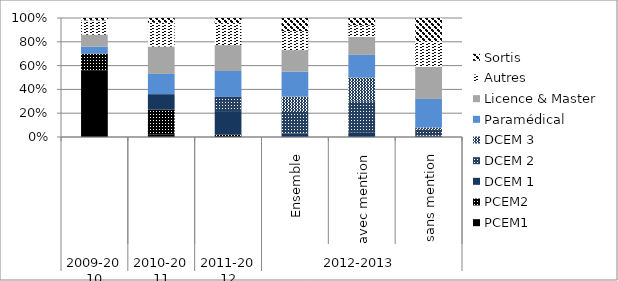
| Category | PCEM1 | PCEM2 | DCEM 1 | DCEM 2 | DCEM 3 | Paramédical | Licence & Master | Autres | Sortis |
|---|---|---|---|---|---|---|---|---|---|
| 0 | 56 | 14 | 0 | 0 | 0 | 6 | 10 | 12 | 2 |
| 1 | 2 | 21 | 13 | 0 | 0 | 17 | 23 | 20 | 4 |
| 2 | 0 | 2 | 20 | 12 | 0 | 22 | 22 | 18 | 5 |
| 3 | 0 | 0 | 3 | 18 | 13 | 21 | 18 | 16 | 11 |
| 4 | 0 | 0 | 4 | 26 | 20 | 19 | 15 | 10 | 6 |
| 5 | 0 | 0 | 1 | 5 | 2 | 24 | 27 | 21 | 20 |